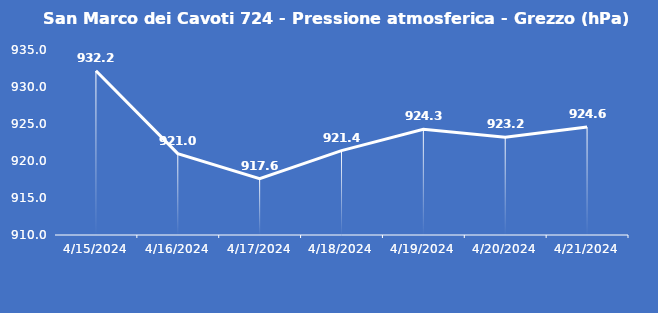
| Category | San Marco dei Cavoti 724 - Pressione atmosferica - Grezzo (hPa) |
|---|---|
| 4/15/24 | 932.2 |
| 4/16/24 | 921 |
| 4/17/24 | 917.6 |
| 4/18/24 | 921.4 |
| 4/19/24 | 924.3 |
| 4/20/24 | 923.2 |
| 4/21/24 | 924.6 |